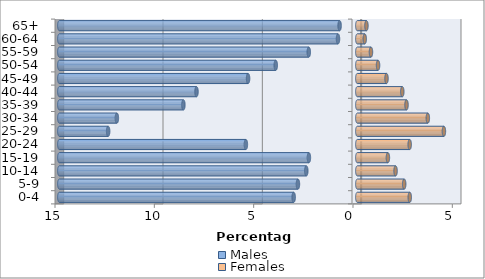
| Category | Males | Females |
|---|---|---|
| 0-4 | -3.205 | 2.639 |
| 5-9 | -2.99 | 2.359 |
| 10-14 | -2.569 | 1.925 |
| 15-19 | -2.439 | 1.538 |
| 20-24 | -5.611 | 2.636 |
| 25-29 | -12.544 | 4.358 |
| 30-34 | -12.104 | 3.549 |
| 35-39 | -8.756 | 2.476 |
| 40-44 | -8.096 | 2.263 |
| 45-49 | -5.5 | 1.468 |
| 50-54 | -4.107 | 1.043 |
| 55-59 | -2.444 | 0.686 |
| 60-64 | -0.974 | 0.372 |
| 65+ | -0.892 | 0.458 |